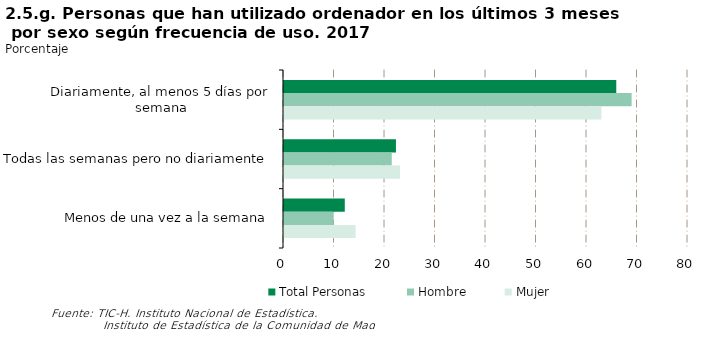
| Category | Total Personas | Hombre | Mujer |
|---|---|---|---|
| Diariamente, al menos 5 días por semana | 65.796 | 68.835 | 62.847 |
| Todas las semanas pero no diariamente | 22.168 | 21.339 | 22.973 |
| Menos de una vez a la semana | 12.036 | 9.826 | 14.18 |